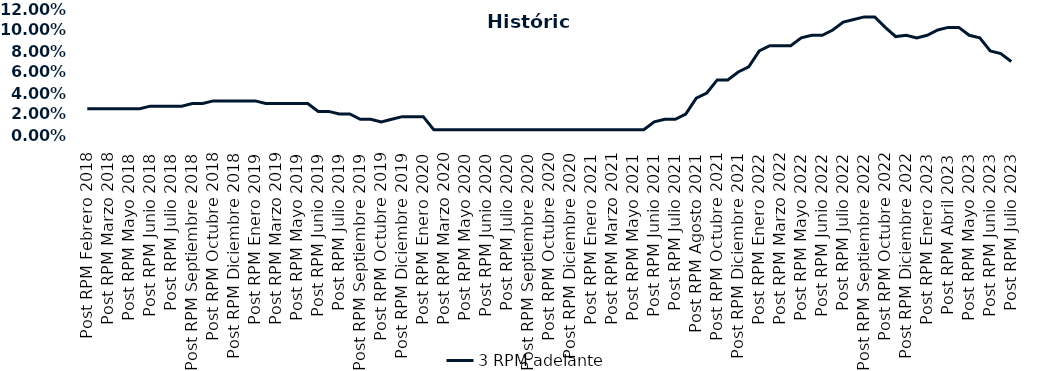
| Category | 3 RPM adelante |
|---|---|
| Post RPM Febrero 2018 | 0.025 |
| Pre RPM Marzo 2018 | 0.025 |
| Post RPM Marzo 2018 | 0.025 |
| Pre RPM Mayo 2018 | 0.025 |
| Post RPM Mayo 2018 | 0.025 |
| Pre RPM Junio 2018 | 0.025 |
| Post RPM Junio 2018 | 0.028 |
| Pre RPM Julio 2018 | 0.028 |
| Post RPM Julio 2018 | 0.028 |
| Pre RPM Septiembre 2018 | 0.028 |
| Post RPM Septiembre 2018 | 0.03 |
| Pre RPM Octubre 2018 | 0.03 |
| Post RPM Octubre 2018 | 0.032 |
| Pre RPM Diciembre 2018 | 0.032 |
| Post RPM Diciembre 2018 | 0.032 |
| Pre RPM Enero 2019 | 0.032 |
| Post RPM Enero 2019 | 0.032 |
| Pre RPM Marzo 2019 | 0.03 |
| Post RPM Marzo 2019 | 0.03 |
| Pre RPM Mayo 2019 | 0.03 |
| Post RPM Mayo 2019 | 0.03 |
| Pre RPM Junio 2019 | 0.03 |
| Post RPM Junio 2019 | 0.022 |
| Pre RPM Julio 2019 | 0.022 |
| Post RPM Julio 2019 | 0.02 |
| Pre RPM Septiembre 2019 | 0.02 |
| Post RPM Septiembre 2019 | 0.015 |
| Pre RPM Octubre 2019 | 0.015 |
| Post RPM Octubre 2019 | 0.012 |
| Pre RPM Diciembre 2019 | 0.015 |
| Post RPM Diciembre 2019 | 0.018 |
| Pre RPM Enero 2020 | 0.018 |
| Post RPM Enero 2020 | 0.018 |
| Pre RPM Marzo 2020 | 0.005 |
| Post RPM Marzo 2020 | 0.005 |
| Pre RPM Mayo 2020 | 0.005 |
| Post RPM Mayo 2020 | 0.005 |
| Pre RPM Junio 2020 | 0.005 |
| Post RPM Junio 2020 | 0.005 |
| Pre RPM Julio 2020 | 0.005 |
| Post RPM Julio 2020 | 0.005 |
| Pre RPM Septiembre 2020 | 0.005 |
| Post RPM Septiembre 2020 | 0.005 |
| Pre RPM Octubre 2020 | 0.005 |
| Post RPM Octubre 2020 | 0.005 |
| Pre RPM Diciembre 2020 | 0.005 |
| Post RPM Diciembre 2020 | 0.005 |
| Pre RPM Enero 2021 | 0.005 |
| Post RPM Enero 2021 | 0.005 |
| Pre RPM Marzo 2021 | 0.005 |
| Post RPM Marzo 2021 | 0.005 |
| Pre RPM Mayo 2021 | 0.005 |
| Post RPM Mayo 2021 | 0.005 |
| Pre RPM Junio 2021 | 0.005 |
| Post RPM Junio 2021 | 0.012 |
| Pre RPM Julio 2021 | 0.015 |
| Post RPM Julio 2021 | 0.015 |
| Pre RPM Agosto 2021 | 0.02 |
| Post RPM Agosto 2021 | 0.035 |
| Pre RPM Octubre 2021 | 0.04 |
| Post RPM Octubre 2021 | 0.052 |
| Pre RPM Diciembre 2021 | 0.052 |
| Post RPM Diciembre 2021 | 0.06 |
| Pre RPM Enero 2022 | 0.065 |
| Post RPM Enero 2022 | 0.08 |
| Pre RPM Marzo 2022 | 0.085 |
| Post RPM Marzo 2022 | 0.085 |
| Pre RPM Mayo 2022 | 0.085 |
| Post RPM Mayo 2022 | 0.092 |
| Pre RPM Junio 2022 | 0.095 |
| Post RPM Junio 2022 | 0.095 |
| Pre RPM Julio 2022 | 0.1 |
| Post RPM Julio 2022 | 0.108 |
| Pre RPM Septiembre 2022 | 0.11 |
| Post RPM Septiembre 2022 | 0.112 |
| Pre RPM Octubre 2022 | 0.112 |
| Post RPM Octubre 2022 | 0.102 |
| Pre RPM Diciembre 2022 | 0.094 |
| Post RPM Diciembre 2022 | 0.095 |
| Pre RPM Enero 2023 | 0.092 |
| Post RPM Enero 2023 | 0.095 |
| Pre RPM Abril 2023 | 0.1 |
| Post RPM Abril 2023 | 0.102 |
| Pre RPM Mayo 2023 | 0.102 |
| Post RPM Mayo 2023 | 0.095 |
| Pre RPM Junio 2023 | 0.092 |
| Post RPM Junio 2023 | 0.08 |
| Pre RPM Julio 2023 | 0.078 |
| Post RPM Julio 2023 | 0.07 |